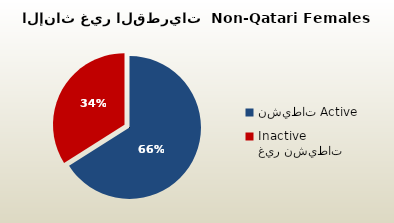
| Category | الاناث غير القطريات  Non-Qatari Females |
|---|---|
| نشيطات Active | 291244 |
| غير نشيطات Inactive | 149855 |